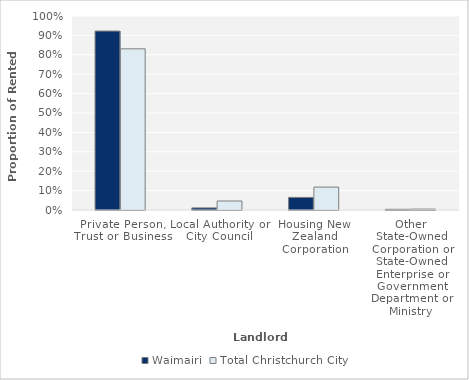
| Category | Waimairi | Total Christchurch City |
|---|---|---|
| Private Person, Trust or Business | 0.922 | 0.831 |
| Local Authority or City Council | 0.011 | 0.046 |
| Housing New Zealand Corporation | 0.065 | 0.118 |
| Other State-Owned Corporation or State-Owned Enterprise or Government Department or Ministry | 0.004 | 0.005 |